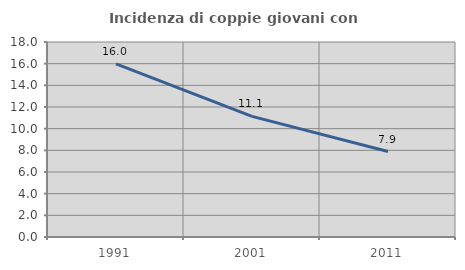
| Category | Incidenza di coppie giovani con figli |
|---|---|
| 1991.0 | 15.986 |
| 2001.0 | 11.139 |
| 2011.0 | 7.889 |